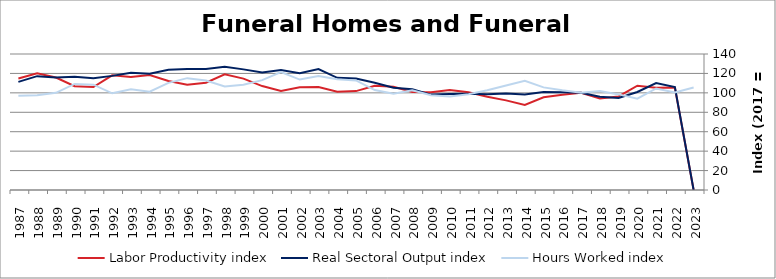
| Category | Labor Productivity index | Real Sectoral Output index | Hours Worked index |
|---|---|---|---|
| 2023.0 | 0 | 0 | 105.577 |
| 2022.0 | 105.473 | 106.003 | 100.503 |
| 2021.0 | 105.336 | 110.127 | 104.548 |
| 2020.0 | 107.394 | 100.937 | 93.988 |
| 2019.0 | 96.345 | 94.815 | 98.413 |
| 2018.0 | 94.292 | 96.088 | 101.905 |
| 2017.0 | 100 | 100 | 100 |
| 2016.0 | 98.003 | 100.536 | 102.585 |
| 2015.0 | 95.516 | 100.903 | 105.64 |
| 2014.0 | 87.512 | 98.402 | 112.444 |
| 2013.0 | 92.276 | 99.31 | 107.622 |
| 2012.0 | 96.043 | 98.61 | 102.673 |
| 2011.0 | 100.619 | 99.195 | 98.585 |
| 2010.0 | 102.807 | 98.946 | 96.244 |
| 2009.0 | 100.572 | 98.214 | 97.655 |
| 2008.0 | 100.933 | 103.641 | 102.683 |
| 2007.0 | 106.286 | 105.362 | 99.131 |
| 2006.0 | 107.301 | 110.346 | 102.838 |
| 2005.0 | 101.803 | 114.834 | 112.8 |
| 2004.0 | 101.26 | 115.512 | 114.074 |
| 2003.0 | 106.001 | 124.455 | 117.409 |
| 2002.0 | 105.655 | 120.108 | 113.679 |
| 2001.0 | 101.844 | 123.547 | 121.31 |
| 2000.0 | 106.973 | 120.973 | 113.087 |
| 1999.0 | 114.664 | 124.165 | 108.286 |
| 1998.0 | 119.065 | 126.784 | 106.483 |
| 1997.0 | 110.382 | 124.469 | 112.762 |
| 1996.0 | 108.29 | 124.682 | 115.137 |
| 1995.0 | 112.276 | 123.84 | 110.299 |
| 1994.0 | 118.348 | 119.711 | 101.152 |
| 1993.0 | 116.328 | 120.648 | 103.714 |
| 1992.0 | 118.026 | 117.471 | 99.53 |
| 1991.0 | 106.008 | 114.936 | 108.422 |
| 1990.0 | 106.875 | 116.671 | 109.166 |
| 1989.0 | 115.81 | 115.887 | 100.067 |
| 1988.0 | 120.207 | 117.203 | 97.501 |
| 1987.0 | 114.83 | 111.278 | 96.907 |